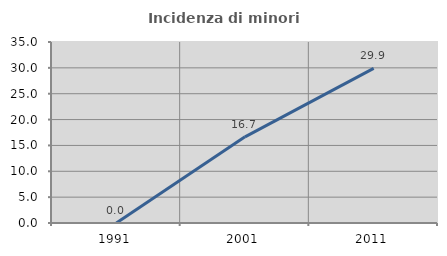
| Category | Incidenza di minori stranieri |
|---|---|
| 1991.0 | 0 |
| 2001.0 | 16.667 |
| 2011.0 | 29.907 |